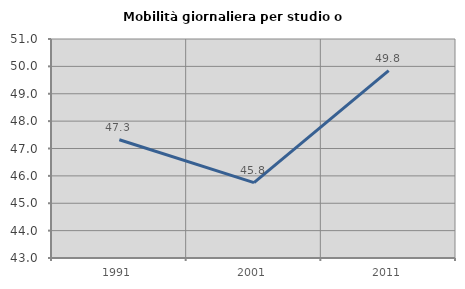
| Category | Mobilità giornaliera per studio o lavoro |
|---|---|
| 1991.0 | 47.321 |
| 2001.0 | 45.751 |
| 2011.0 | 49.847 |